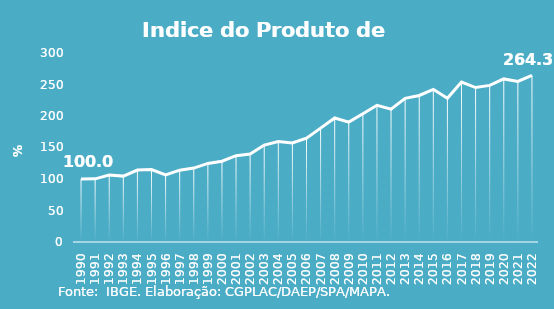
| Category | Indice de Prod. base 1990 |
|---|---|
| 1990.0 | 100 |
| 1991.0 | 100.275 |
| 1992.0 | 106.203 |
| 1993.0 | 104.57 |
| 1994.0 | 114.164 |
| 1995.0 | 115.024 |
| 1996.0 | 106.552 |
| 1997.0 | 114.037 |
| 1998.0 | 117.319 |
| 1999.0 | 124.734 |
| 2000.0 | 128.293 |
| 2001.0 | 136.975 |
| 2002.0 | 139.51 |
| 2003.0 | 153.868 |
| 2004.0 | 159.641 |
| 2005.0 | 157.136 |
| 2006.0 | 164.858 |
| 2007.0 | 180.781 |
| 2008.0 | 196.91 |
| 2009.0 | 190.309 |
| 2010.0 | 203.581 |
| 2011.0 | 217.041 |
| 2012.0 | 210.932 |
| 2013.0 | 228.009 |
| 2014.0 | 232.562 |
| 2015.0 | 242.318 |
| 2016.0 | 228.239 |
| 2017.0 | 253.826 |
| 2018.0 | 245.134 |
| 2019.0 | 248.619 |
| 2020.0 | 258.848 |
| 2021.0 | 254.988 |
| 2022.0 | 264.336 |